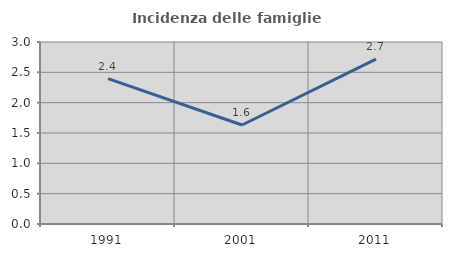
| Category | Incidenza delle famiglie numerose |
|---|---|
| 1991.0 | 2.397 |
| 2001.0 | 1.632 |
| 2011.0 | 2.719 |